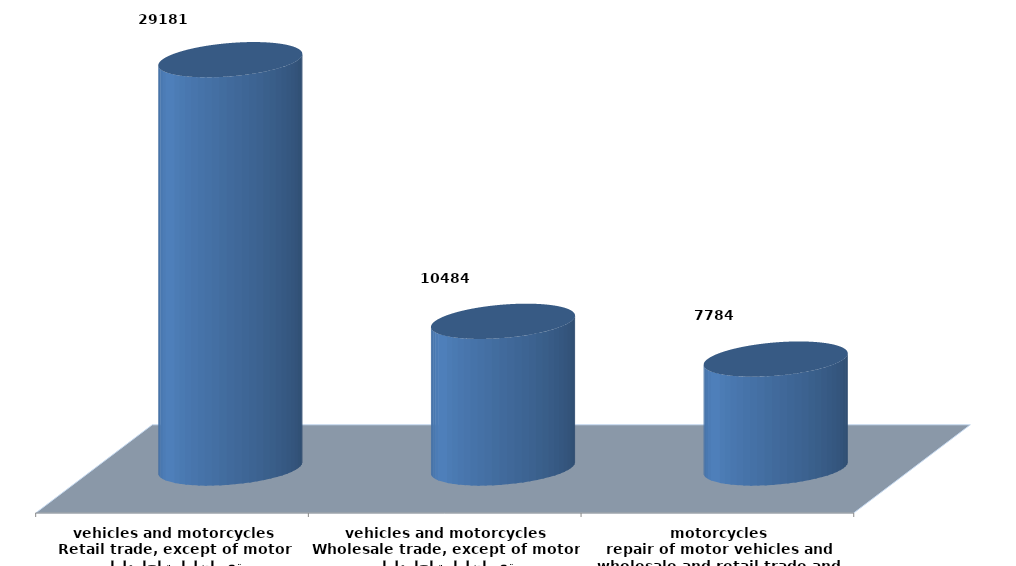
| Category | Series 0 |
|---|---|
| تجارة الجملة والتجزئة ،واصلاح المركبات ذات المحركات والدراجات النارية
wholesale and retail trade and repair of motor vehicles and motorcycles | 7784111 |
| تجارة الجملة ، باستثناء المركبات ذات المحركات والدراجات النارية
Wholesale trade, except of motor vehicles and motorcycles | 10483583 |
| تجارة التجزئة،باستثناء المركبات ذات المحركات والدراجات النارية
Retail trade, except of motor vehicles and motorcycles | 29180734 |